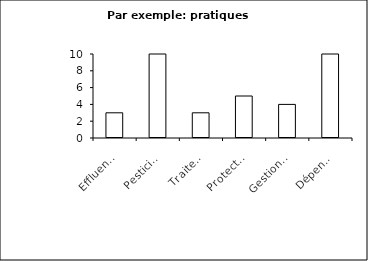
| Category | Series 0 | Series 1 |
|---|---|---|
| Effluents organiques liquides | 0 | 3 |
| Pesticides  | 0 | 13 |
| Traitements vétérinaires | 0 | 3 |
| Protection de la ressource des sols | 0 | 5 |
| Gestion de la ressource en eau | 0 | 4 |
| Dépendance énergétique | 0 | 10 |